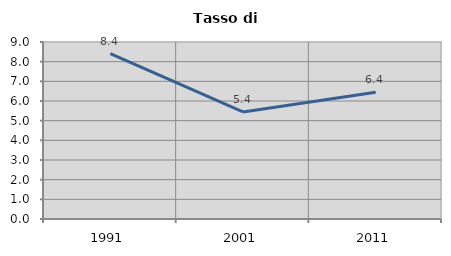
| Category | Tasso di disoccupazione   |
|---|---|
| 1991.0 | 8.403 |
| 2001.0 | 5.442 |
| 2011.0 | 6.44 |